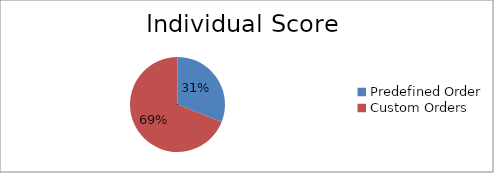
| Category | Sorting Order |
|---|---|
| Predefined Order | 49 |
| Custom Orders | 109 |